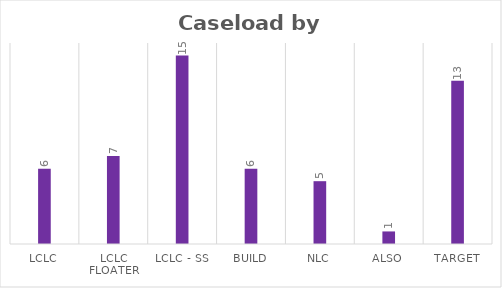
| Category | Series 0 |
|---|---|
| LCLC | 6 |
| LCLC Floater | 7 |
| LCLC - SS | 15 |
| BUILD | 6 |
| NLC | 5 |
| ALSO | 1 |
| Target | 13 |